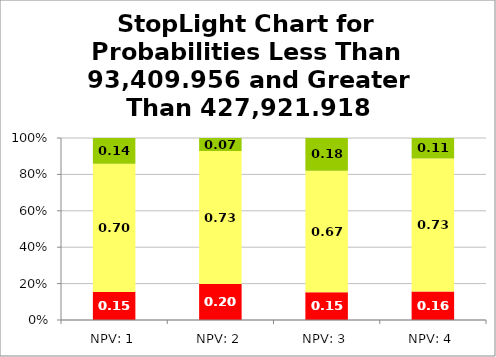
| Category | Series 0 | Series 1 | Series 2 |
|---|---|---|---|
| NPV: 1 | 0.154 | 0.704 | 0.142 |
| NPV: 2 | 0.198 | 0.73 | 0.072 |
| NPV: 3 | 0.152 | 0.668 | 0.18 |
| NPV: 4 | 0.156 | 0.732 | 0.112 |